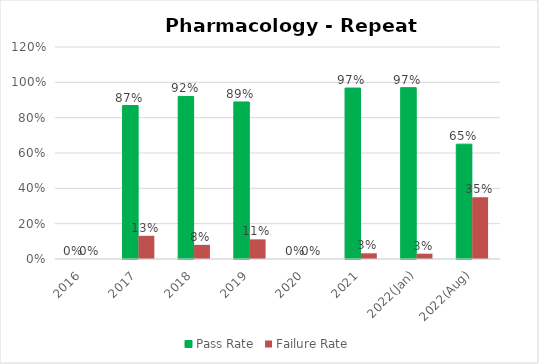
| Category | Pass Rate | Failure Rate |
|---|---|---|
| 2016 | 0 | 0 |
| 2017 | 0.869 | 0.131 |
| 2018 | 0.92 | 0.08 |
| 2019 | 0.889 | 0.111 |
| 2020 | 0 | 0 |
| 2021 | 0.968 | 0.032 |
| 2022(Jan) | 0.97 | 0.03 |
| 2022(Aug) | 0.65 | 0.35 |